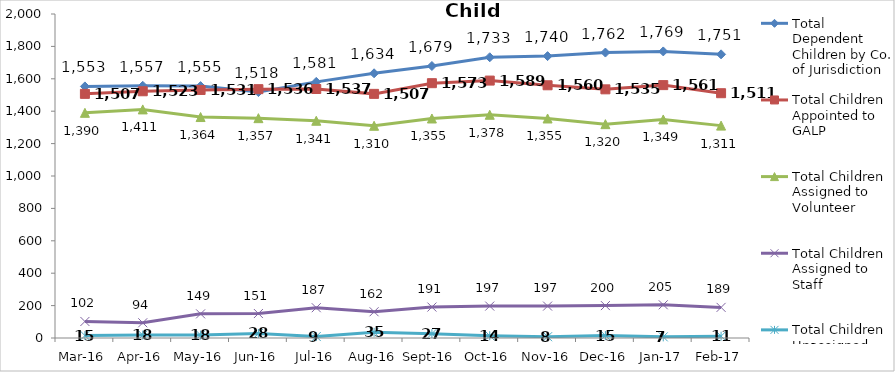
| Category | Total Dependent Children by Co. of Jurisdiction | Total Children Appointed to GALP | Total Children Assigned to Volunteer | Total Children Assigned to Staff | Total Children Unassigned |
|---|---|---|---|---|---|
| Mar-16 | 1553 | 1507 | 1390 | 102 | 15 |
| Apr-16 | 1557 | 1523 | 1411 | 94 | 18 |
| May-16 | 1555 | 1531 | 1364 | 149 | 18 |
| Jun-16 | 1518 | 1536 | 1357 | 151 | 28 |
| Jul-16 | 1581 | 1537 | 1341 | 187 | 9 |
| Aug-16 | 1634 | 1507 | 1310 | 162 | 35 |
| Sep-16 | 1679 | 1573 | 1355 | 191 | 27 |
| Oct-16 | 1733 | 1589 | 1378 | 197 | 14 |
| Nov-16 | 1740 | 1560 | 1355 | 197 | 8 |
| Dec-16 | 1762 | 1535 | 1320 | 200 | 15 |
| Jan-17 | 1769 | 1561 | 1349 | 205 | 7 |
| Feb-17 | 1751 | 1511 | 1311 | 189 | 11 |